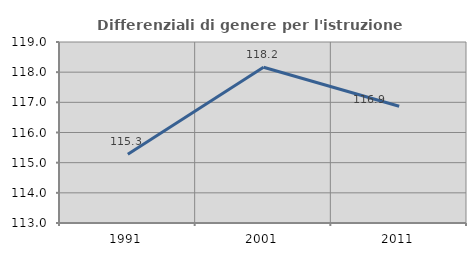
| Category | Differenziali di genere per l'istruzione superiore |
|---|---|
| 1991.0 | 115.278 |
| 2001.0 | 118.161 |
| 2011.0 | 116.87 |